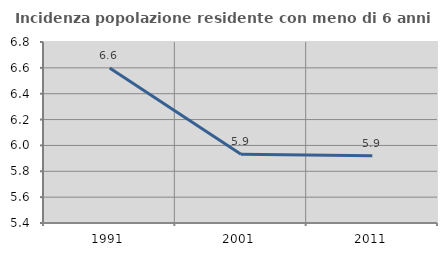
| Category | Incidenza popolazione residente con meno di 6 anni |
|---|---|
| 1991.0 | 6.598 |
| 2001.0 | 5.932 |
| 2011.0 | 5.92 |